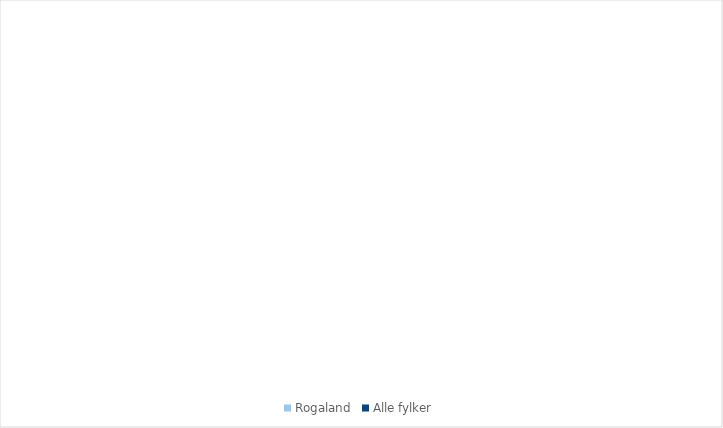
| Category | Rogaland | Alle fylker |
|---|---|---|
| 1.1 Landbruk | 0.905 | 0.814 |
| 1.2 Fiske/oppdrett | 0.754 | 1.732 |
| 2.1 Primærforedlingsindustri | 2.389 | 2.443 |
| 2.2 Olje/gass, bergverk | 15.448 | 2.052 |
| 2.3 Teknologiindustri | 2.984 | 1.926 |
| 2.4 Annen industri | 4.36 | 3.764 |
| 3.1 Bygg/anlegg, energi, vann/
avløp, eiendom | 17.839 | 21.135 |
| 3.2 Transport- og distribusjonstjenester | 6.137 | 4.233 |
| 4.1 Kunnskapsintensiv forretningsmessig tjenesteyting (KIFT) | 12.529 | 16.953 |
| 4.2 Varehandel | 7.803 | 9.688 |
| 4.3 Overnatting og servering | 1.816 | 1.718 |
| 4.4 Annen privat dominert tjenesteyting | 5.036 | 5.772 |
| 5.1 Offentlig admistrasjon og forsvar | 5.03 | 8.035 |
| 5.2 Undervisning | 5.513 | 6.39 |
| 5.3 Helse- og omsorgstjenester | 11.456 | 13.343 |